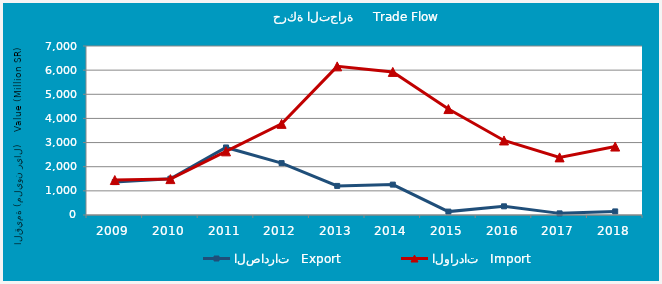
| Category | الصادرات   Export | الواردات   Import |
|---|---|---|
| 2009.0 | 1363600203 | 1448325328 |
| 2010.0 | 1502527670 | 1486227462 |
| 2011.0 | 2797715588 | 2636346309 |
| 2012.0 | 2149008386 | 3774731061 |
| 2013.0 | 1204835480 | 6156316521 |
| 2014.0 | 1258546192 | 5926370595 |
| 2015.0 | 140856819 | 4387352227 |
| 2016.0 | 359236959 | 3087136968 |
| 2017.0 | 67673783 | 2386369685 |
| 2018.0 | 148367301 | 2835172657 |